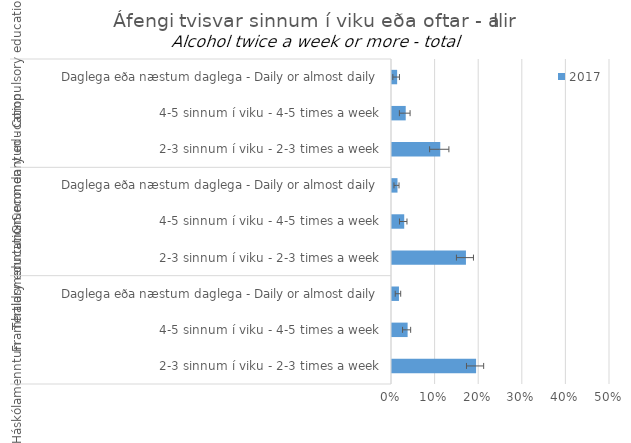
| Category | 2017 |
|---|---|
| 0 | 0.012 |
| 1 | 0.031 |
| 2 | 0.111 |
| 3 | 0.013 |
| 4 | 0.028 |
| 5 | 0.17 |
| 6 | 0.016 |
| 7 | 0.036 |
| 8 | 0.193 |